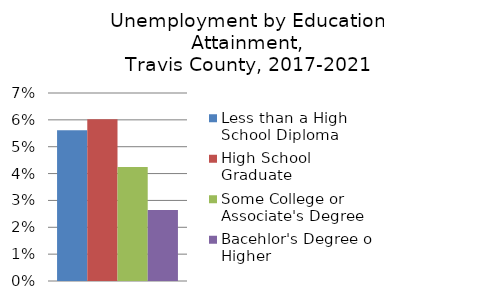
| Category | Less than a High School Diploma | High School Graduate | Some College or Associate's Degree | Bacehlor's Degree or Higher |
|---|---|---|---|---|
| 0 | 0.056 | 0.06 | 0.042 | 0.026 |